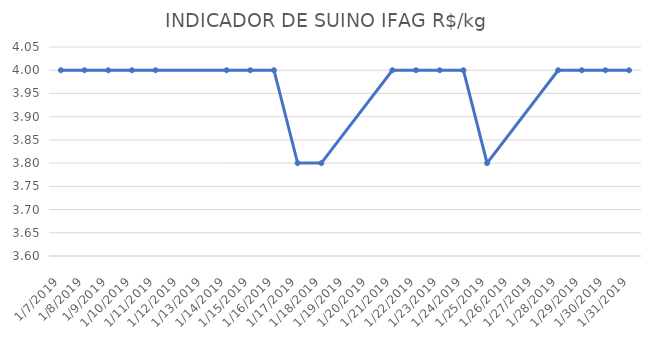
| Category | INDICADOR DE SUINO IFAG |
|---|---|
| 1/7/19 | 4 |
| 1/8/19 | 4 |
| 1/9/19 | 4 |
| 1/10/19 | 4 |
| 1/11/19 | 4 |
| 1/14/19 | 4 |
| 1/15/19 | 4 |
| 1/16/19 | 4 |
| 1/17/19 | 3.8 |
| 1/18/19 | 3.8 |
| 1/21/19 | 4 |
| 1/22/19 | 4 |
| 1/23/19 | 4 |
| 1/24/19 | 4 |
| 1/25/19 | 3.8 |
| 1/28/19 | 4 |
| 1/29/19 | 4 |
| 1/30/19 | 4 |
| 1/31/19 | 4 |